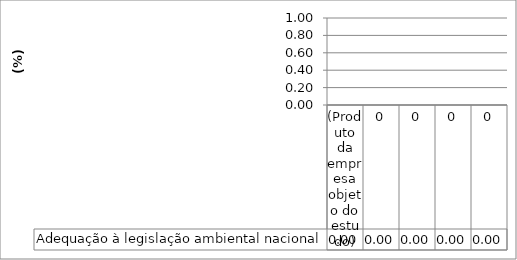
| Category | Adequação à legislação ambiental nacional |
|---|---|
| (Produto da empresa objeto do estudo) | 0 |
| 0 | 0 |
| 0 | 0 |
| 0 | 0 |
| 0 | 0 |